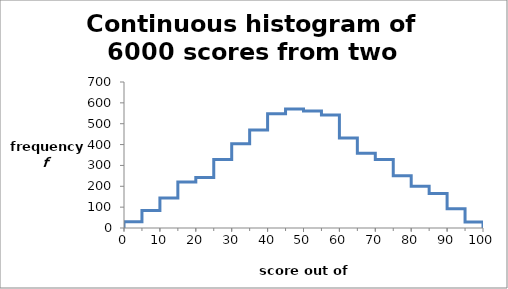
| Category | Series 0 |
|---|---|
| 0.0 | 0 |
| 0.0 | 30 |
| 5.0 | 30 |
| 5.0 | 84 |
| 10.0 | 84 |
| 10.0 | 144 |
| 15.0 | 144 |
| 15.0 | 221 |
| 20.0 | 221 |
| 20.0 | 242 |
| 25.0 | 242 |
| 25.0 | 328 |
| 30.0 | 328 |
| 30.0 | 404 |
| 35.0 | 404 |
| 35.0 | 470 |
| 40.0 | 470 |
| 40.0 | 548 |
| 45.0 | 548 |
| 45.0 | 571 |
| 50.0 | 571 |
| 50.0 | 561 |
| 55.0 | 561 |
| 55.0 | 542 |
| 60.0 | 542 |
| 60.0 | 431 |
| 65.0 | 431 |
| 65.0 | 358 |
| 70.0 | 358 |
| 70.0 | 329 |
| 75.0 | 329 |
| 75.0 | 250 |
| 80.0 | 250 |
| 80.0 | 200 |
| 85.0 | 200 |
| 85.0 | 166 |
| 90.0 | 166 |
| 90.0 | 92 |
| 95.0 | 92 |
| 95.0 | 29 |
| 100.0 | 29 |
| 100.0 | 0 |